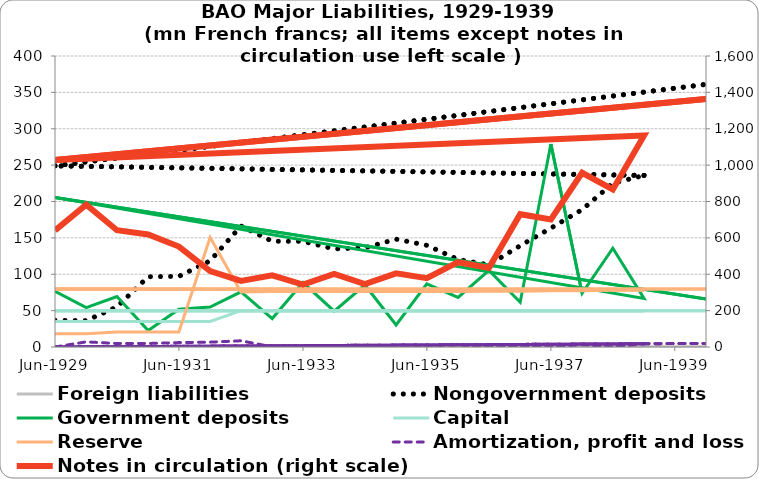
| Category | Foreign liabilities | Nongovernment deposits | Government deposits | Capital  | Reserve | Amortization, profit and loss |
|---|---|---|---|---|---|---|
| 1929-06-30 | 0 | 36.742 | 76.541 | 35 | 18.376 | 0 |
| 1929-12-31 | 0 | 36.243 | 54.16 | 35 | 18.376 | 7.06 |
| 1930-06-30 | 0 | 55.161 | 69.366 | 35 | 20.604 | 4.837 |
| 1930-12-31 | 0 | 96.588 | 22.631 | 35 | 20.604 | 4.837 |
| 1931-06-30 | 0 | 97.091 | 51.993 | 35 | 20.604 | 6.069 |
| 1931-12-31 | 0 | 118.463 | 54.826 | 35 | 150.604 | 6.676 |
| 1932-06-30 | 0 | 166.364 | 75.824 | 50 | 75.604 | 8.531 |
| 1932-12-31 | 0 | 145.335 | 39.051 | 50 | 76.158 | 0.248 |
| 1933-06-30 | 0 | 145.213 | 88.615 | 50 | 76.158 | 0.388 |
| 1933-12-31 | 0 | 134.829 | 49.181 | 50 | 76.158 | 0.616 |
| 1934-06-30 | 0 | 136.331 | 85.225 | 50 | 76.158 | 1.012 |
| 1934-12-31 | 0 | 148.203 | 30.309 | 50 | 76.158 | 1.289 |
| 1935-06-30 | 0 | 139.764 | 86.717 | 50 | 76.158 | 1.768 |
| 1935-12-31 | 0 | 120.368 | 68.11 | 50 | 76.158 | 2.679 |
| 1936-06-30 | 0 | 112.887 | 105.324 | 50 | 76.712 | 0 |
| 1936-12-31 | 0 | 139.257 | 61.501 | 50 | 76.712 | 1.378 |
| 1937-06-30 | 0 | 163.366 | 278.987 | 50 | 77.374 | 0 |
| 1937-12-31 | 0 | 188.809 | 73.805 | 50 | 77.374 | 3.196 |
| 1938-06-30 | 0 | 225.103 | 135.85 | 50 | 78.336 | 0 |
| 1938-12-31 | 0 | 235.815 | 66.611 | 50 | 78.336 | 4.461 |
| 1929-06-30 | 0 | 249.029 | 205.468 | 50 | 79.754 | 0 |
| 1939-12-31 | 0 | 361.058 | 65.972 | 50 | 79.754 | 4.981 |